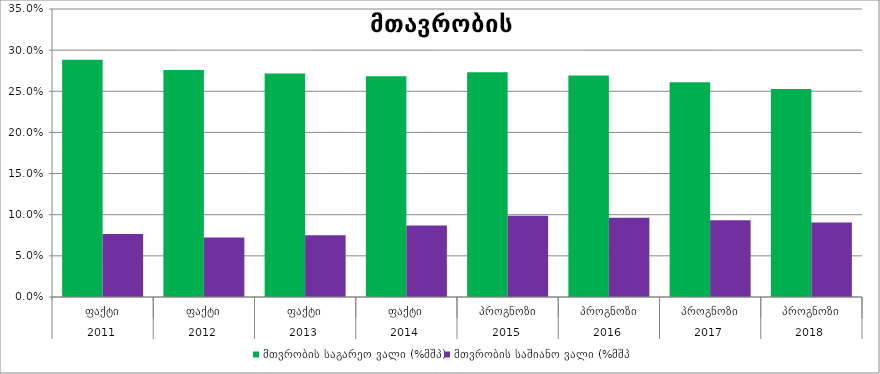
| Category | მთვრობის საგარეო ვალი (%მშპ) | მთვრობის საშიანო ვალი (%მშპ) |
|---|---|---|
| 0 | 0.288 | 0.077 |
| 1 | 0.276 | 0.072 |
| 2 | 0.272 | 0.075 |
| 3 | 0.268 | 0.087 |
| 4 | 0.273 | 0.099 |
| 5 | 0.269 | 0.096 |
| 6 | 0.261 | 0.093 |
| 7 | 0.253 | 0.091 |